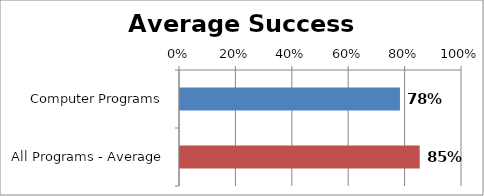
| Category | RetentionRate |
|---|---|
| Computer Programs | 0.78 |
| All Programs - Average | 0.85 |